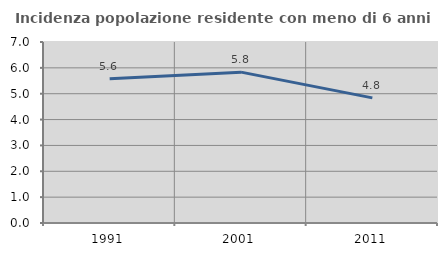
| Category | Incidenza popolazione residente con meno di 6 anni |
|---|---|
| 1991.0 | 5.582 |
| 2001.0 | 5.835 |
| 2011.0 | 4.839 |